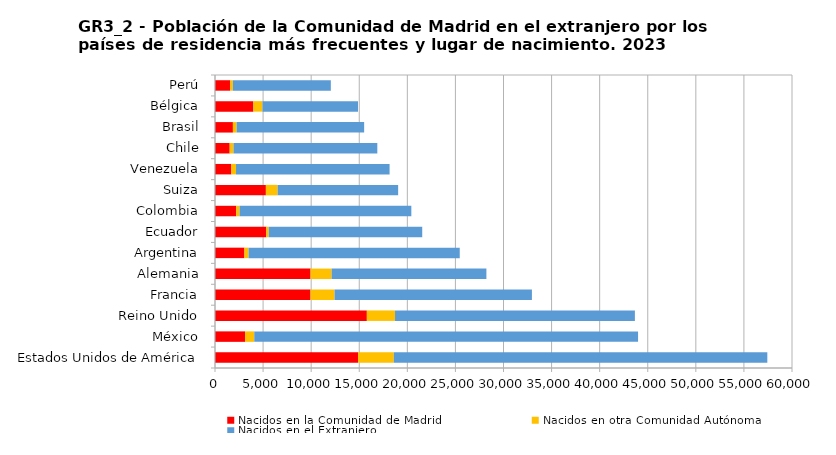
| Category | Nacidos en la Comunidad de Madrid | Nacidos en otra Comunidad Autónoma | Nacidos en el Extranjero |
|---|---|---|---|
|     Estados Unidos de América | 14876 | 3717 | 38841 |
|     México | 3132 | 950 | 39910 |
|     Reino Unido | 15789 | 2931 | 24944 |
|     Francia | 9926 | 2508 | 20521 |
|     Alemania | 9930 | 2197 | 16095 |
|     Argentina | 3061 | 430 | 21960 |
|     Ecuador | 5336 | 255 | 15958 |
|     Colombia | 2207 | 352 | 17858 |
|     Suiza | 5291 | 1223 | 12530 |
|     Venezuela | 1699 | 486 | 15970 |
|     Chile | 1528 | 401 | 14950 |
|     Brasil | 1862 | 387 | 13260 |
|     Bélgica | 3990 | 948 | 9934 |
|     Perú | 1572 | 288 | 10185 |